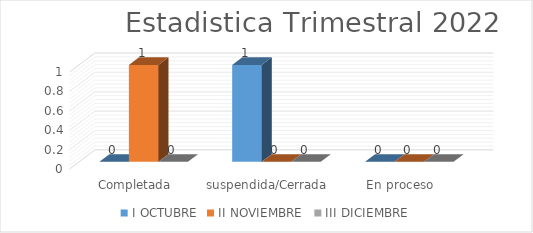
| Category | I | II | III |
|---|---|---|---|
| Completada | 0 | 1 | 0 |
| suspendida/Cerrada | 1 | 0 | 0 |
| En proceso | 0 | 0 | 0 |